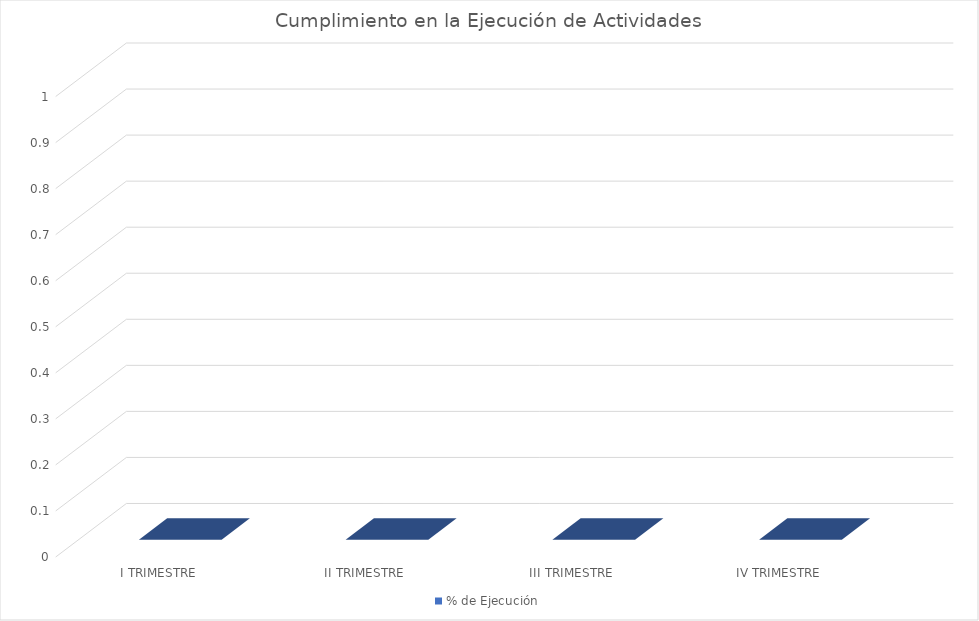
| Category | % de Ejecución |
|---|---|
| I TRIMESTRE | 0 |
| II TRIMESTRE | 0 |
| III TRIMESTRE | 0 |
| IV TRIMESTRE | 0 |